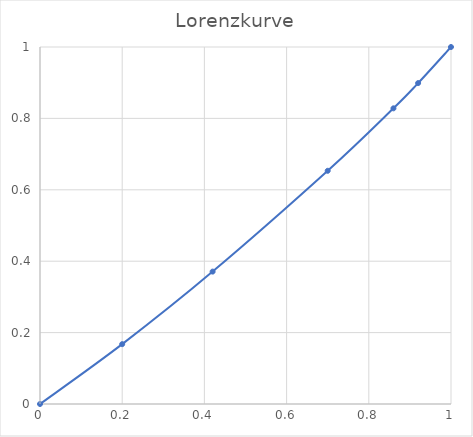
| Category | y |
|---|---|
| 0.0 | 0 |
| 0.2 | 0.168 |
| 0.42 | 0.371 |
| 0.7 | 0.653 |
| 0.86 | 0.828 |
| 0.92 | 0.899 |
| 1.0 | 1 |